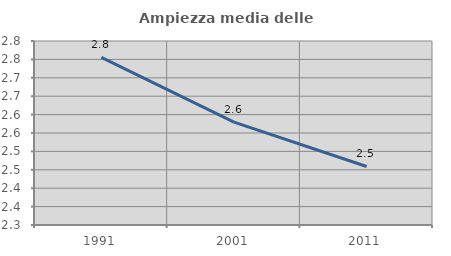
| Category | Ampiezza media delle famiglie |
|---|---|
| 1991.0 | 2.756 |
| 2001.0 | 2.58 |
| 2011.0 | 2.459 |